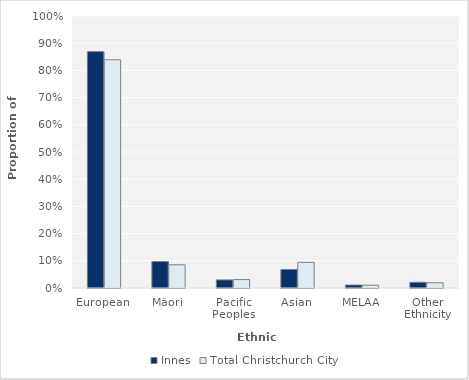
| Category | Innes | Total Christchurch City |
|---|---|---|
| European | 0.869 | 0.839 |
| Mäori | 0.097 | 0.085 |
| Pacific Peoples | 0.03 | 0.031 |
| Asian | 0.068 | 0.094 |
| MELAA | 0.011 | 0.01 |
| Other Ethnicity | 0.021 | 0.019 |